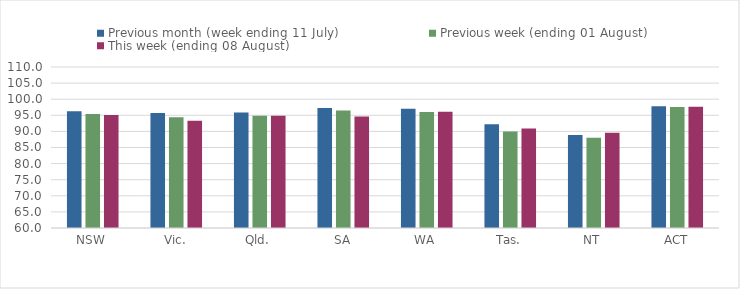
| Category | Previous month (week ending 11 July) | Previous week (ending 01 August) | This week (ending 08 August) |
|---|---|---|---|
| NSW | 96.261 | 95.388 | 95.088 |
| Vic. | 95.736 | 94.367 | 93.312 |
| Qld. | 95.847 | 94.85 | 94.899 |
| SA | 97.261 | 96.503 | 94.646 |
| WA | 97.034 | 96.011 | 96.128 |
| Tas. | 92.231 | 89.94 | 90.875 |
| NT | 88.851 | 88.046 | 89.572 |
| ACT | 97.806 | 97.575 | 97.642 |